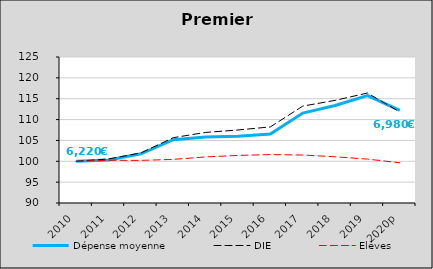
| Category | Dépense moyenne  | DIE  | Elèves |
|---|---|---|---|
| 2010 | 100 | 100 | 100 |
| 2011 | 100.314 | 100.554 | 100.239 |
| 2012 | 101.788 | 102.005 | 100.213 |
| 2013 | 105.176 | 105.659 | 100.46 |
| 2014 | 105.815 | 106.92 | 101.044 |
| 2015 | 106.018 | 107.503 | 101.401 |
| 2016 | 106.532 | 108.24 | 101.604 |
| 2017 | 111.556 | 113.227 | 101.497 |
| 2018 | 113.376 | 114.599 | 101.078 |
| 2019 | 115.757 | 116.364 | 100.525 |
| 2020p | 112.215 | 111.815 | 99.643 |